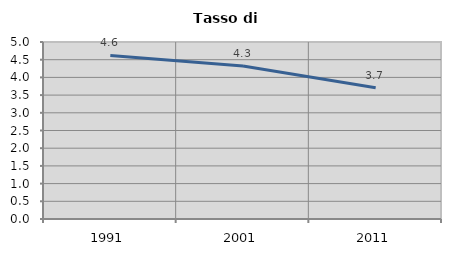
| Category | Tasso di disoccupazione   |
|---|---|
| 1991.0 | 4.62 |
| 2001.0 | 4.322 |
| 2011.0 | 3.711 |